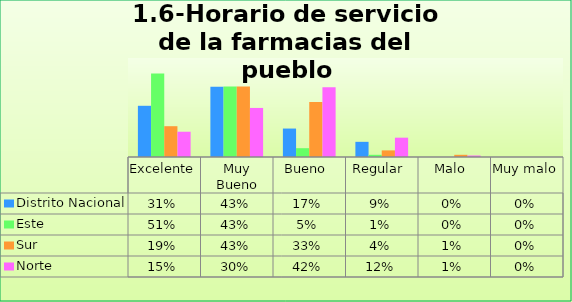
| Category | Distrito Nacional | Este | Sur  | Norte |
|---|---|---|---|---|
| Excelente | 0.31 | 0.507 | 0.187 | 0.153 |
| Muy Bueno | 0.425 | 0.427 | 0.427 | 0.297 |
| Bueno  | 0.172 | 0.053 | 0.333 | 0.423 |
| Regular  | 0.092 | 0.013 | 0.04 | 0.117 |
| Malo  | 0 | 0 | 0.013 | 0.009 |
| Muy malo  | 0 | 0 | 0 | 0 |